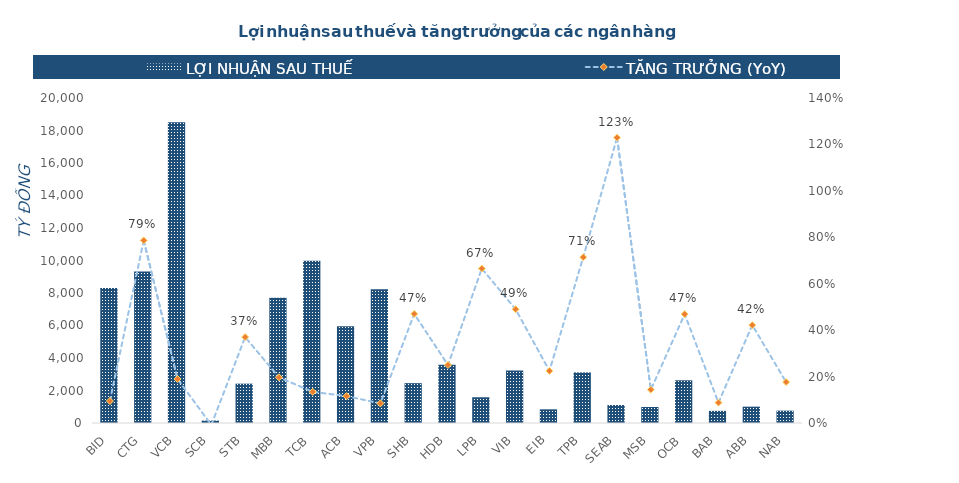
| Category | LỢI NHUẬN SAU THUẾ  |
|---|---|
| BID | 8306.761 |
| CTG | 9319.424 |
| VCB | 18508.187 |
| SCB | 149.594 |
| STB | 2420.118 |
| MBB | 7709.323 |
| TCB | 9979.848 |
| ACB | 5961.064 |
| VPB | 8231.589 |
| SHB | 2451.424 |
| HDB | 3589.686 |
| LPB | 1583.668 |
| VIB | 3225.075 |
| EIB | 841.511 |
| TPB | 3112.036 |
| SEAB | 1105.456 |
| MSB | 986.231 |
| OCB | 2627.637 |
| BAB | 747.219 |
| ABB | 1005.165 |
| NAB | 759.966 |